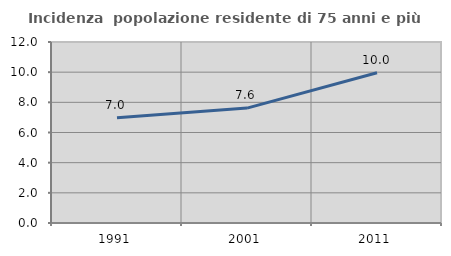
| Category | Incidenza  popolazione residente di 75 anni e più |
|---|---|
| 1991.0 | 6.984 |
| 2001.0 | 7.619 |
| 2011.0 | 9.96 |